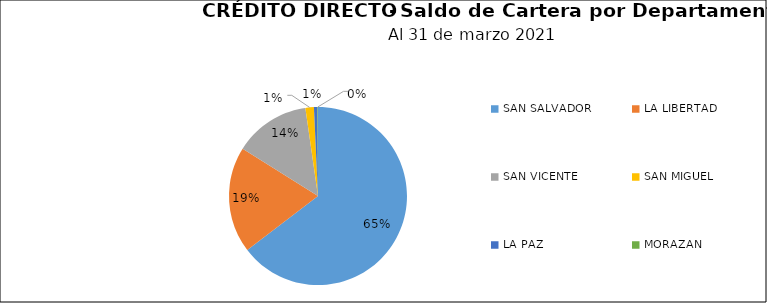
| Category | Saldo | Créditos |
|---|---|---|
| SAN SALVADOR | 86.498 | 30 |
| LA LIBERTAD | 25.861 | 17 |
| SAN VICENTE | 18.473 | 1 |
| SAN MIGUEL | 2.057 | 3 |
| LA PAZ | 0.853 | 1 |
| MORAZAN | 0.126 | 1 |